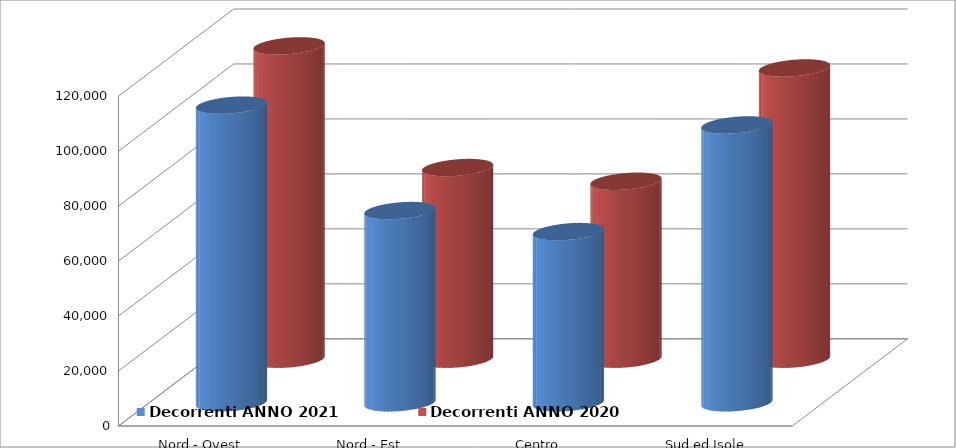
| Category | Decorrenti ANNO 2021 | Decorrenti ANNO 2020 |
|---|---|---|
| Nord - Ovest | 108303 | 114002 |
| Nord - Est | 69943 | 69730 |
| Centro | 62296 | 64747 |
| Sud ed Isole | 101105 | 105972 |